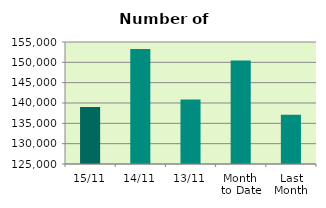
| Category | Series 0 |
|---|---|
| 15/11 | 139044 |
| 14/11 | 153266 |
| 13/11 | 140862 |
| Month 
to Date | 150432.909 |
| Last
Month | 137122.087 |